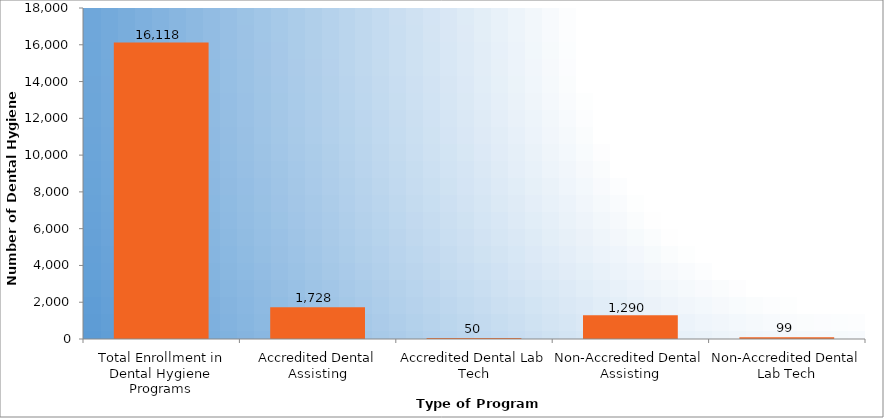
| Category | Number of Dental Hygiene Students |
|---|---|
| Total Enrollment in Dental Hygiene Programs | 16118 |
| Accredited Dental Assisting | 1728 |
| Accredited Dental Lab Tech | 50 |
| Non-Accredited Dental Assisting | 1290 |
| Non-Accredited Dental Lab Tech | 99 |